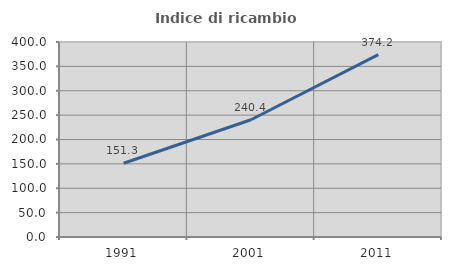
| Category | Indice di ricambio occupazionale  |
|---|---|
| 1991.0 | 151.327 |
| 2001.0 | 240.445 |
| 2011.0 | 374.152 |